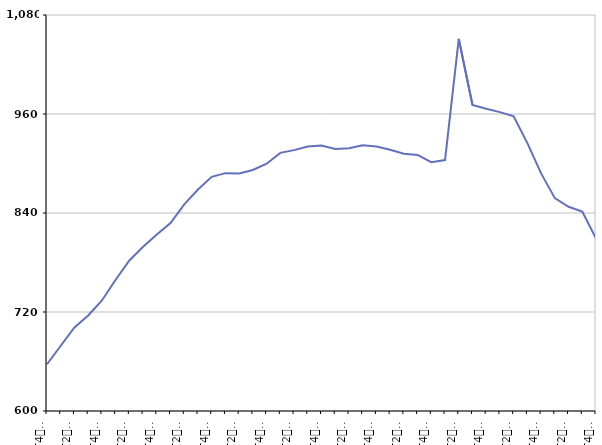
| Category | 50 ans ou plus |
|---|---|
| T4
2012 | 656.7 |
| T1
2013 | 679.1 |
| T2
2013 | 701.2 |
| T3
2013 | 715.7 |
| T4
2013 | 734 |
| T1
2014 | 759.1 |
| T2
2014 | 782.4 |
| T3
2014 | 799 |
| T4
2014 | 814 |
| T1
2015 | 827.8 |
| T2
2015 | 850.5 |
| T3
2015 | 868.4 |
| T4
2015 | 883.9 |
| T1
2016 | 888.3 |
| T2
2016 | 888 |
| T3
2016 | 892.2 |
| T4
2016 | 899.8 |
| T1
2017 | 912.9 |
| T2
2017 | 916.2 |
| T3
2017 | 920.6 |
| T4
2017 | 921.7 |
| T1
2018 | 917.6 |
| T2
2018 | 918.5 |
| T3
2018 | 922.1 |
| T4
2018 | 920.6 |
| T1
2019 | 916.7 |
| T2
2019 | 911.9 |
| T3
2019 | 910.4 |
| T4
2019 | 901.6 |
| T1
2020 | 904.2 |
| T2
2020 | 1051.1 |
| T3
2020 | 971 |
| T4
2020 | 966.3 |
| T1
2021 | 962.3 |
| T2
2021 | 957.1 |
| T3
2021 | 924.7 |
| T4
2021 | 888 |
| T1
2022 | 858 |
| T2
2022 | 847.5 |
| T3
2022 | 841.8 |
| T4
2022 | 809.1 |